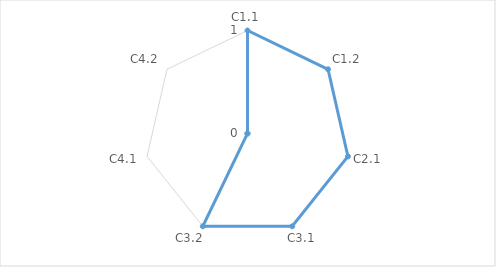
| Category | Series 0 | "" | 1 | 2 | 3 | 4 |
|---|---|---|---|---|---|---|
| C1.1 | 1 |  |  |  |  |  |
| C1.2 | 1 |  |  |  |  |  |
| C2.1 | 1 |  |  |  |  |  |
| C3.1 | 1 |  |  |  |  |  |
| C3.2 | 1 |  |  |  |  |  |
| C4.1 | 0 |  |  |  |  |  |
| C4.2 | 0 |  |  |  |  |  |